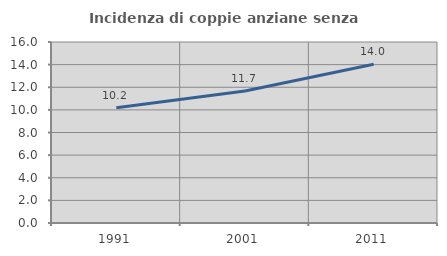
| Category | Incidenza di coppie anziane senza figli  |
|---|---|
| 1991.0 | 10.18 |
| 2001.0 | 11.662 |
| 2011.0 | 14.031 |